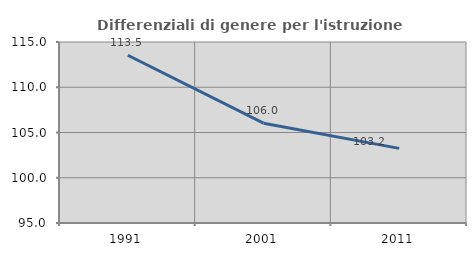
| Category | Differenziali di genere per l'istruzione superiore |
|---|---|
| 1991.0 | 113.537 |
| 2001.0 | 106.03 |
| 2011.0 | 103.248 |